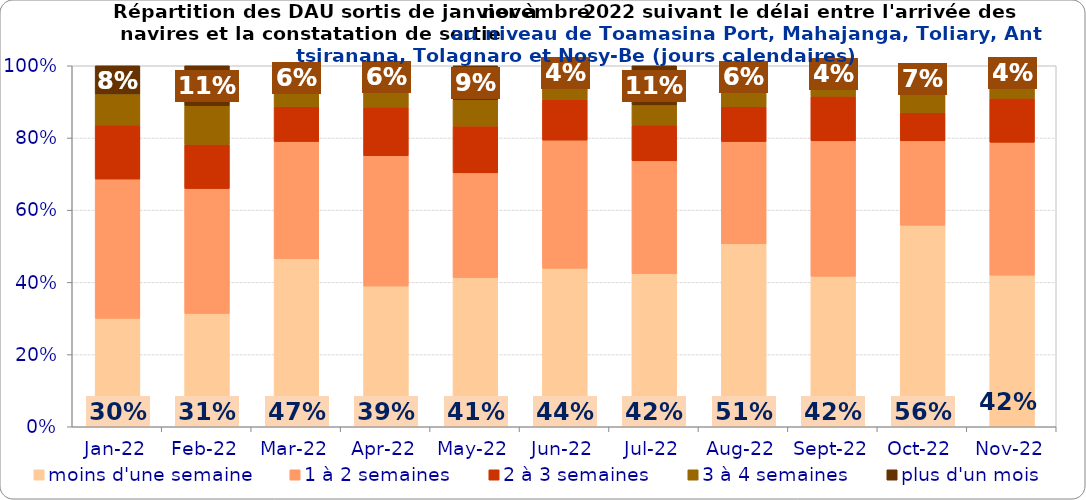
| Category | moins d'une semaine | 1 à 2 semaines | 2 à 3 semaines | 3 à 4 semaines | plus d'un mois |
|---|---|---|---|---|---|
| 2022-01-01 | 0.3 | 0.386 | 0.149 | 0.087 | 0.078 |
| 2022-02-01 | 0.314 | 0.346 | 0.122 | 0.107 | 0.111 |
| 2022-03-01 | 0.465 | 0.325 | 0.097 | 0.048 | 0.065 |
| 2022-04-01 | 0.39 | 0.361 | 0.135 | 0.054 | 0.061 |
| 2022-05-01 | 0.413 | 0.29 | 0.13 | 0.073 | 0.094 |
| 2022-06-01 | 0.439 | 0.355 | 0.112 | 0.053 | 0.041 |
| 2022-07-01 | 0.424 | 0.313 | 0.099 | 0.056 | 0.108 |
| 2022-08-01 | 0.507 | 0.283 | 0.097 | 0.051 | 0.062 |
| 2022-09-01 | 0.417 | 0.375 | 0.124 | 0.042 | 0.042 |
| 2022-10-01 | 0.558 | 0.234 | 0.078 | 0.06 | 0.07 |
| 2022-11-01 | 0.42 | 0.368 | 0.122 | 0.049 | 0.041 |